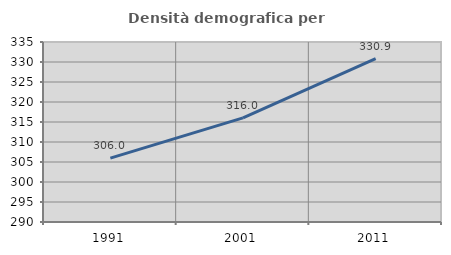
| Category | Densità demografica |
|---|---|
| 1991.0 | 305.953 |
| 2001.0 | 316.037 |
| 2011.0 | 330.863 |